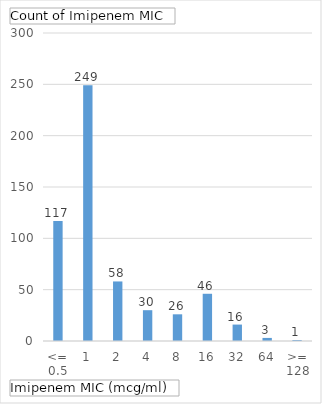
| Category | Total |
|---|---|
| <= 0.5 | 117 |
| 1 | 249 |
| 2 | 58 |
| 4 | 30 |
| 8 | 26 |
| 16 | 46 |
| 32 | 16 |
| 64 | 3 |
| >= 128 | 1 |